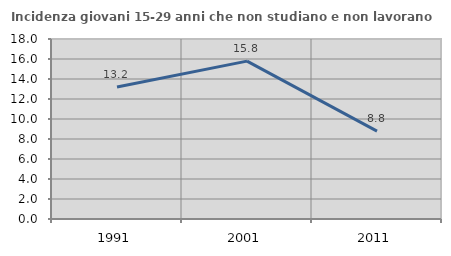
| Category | Incidenza giovani 15-29 anni che non studiano e non lavorano  |
|---|---|
| 1991.0 | 13.208 |
| 2001.0 | 15.789 |
| 2011.0 | 8.791 |